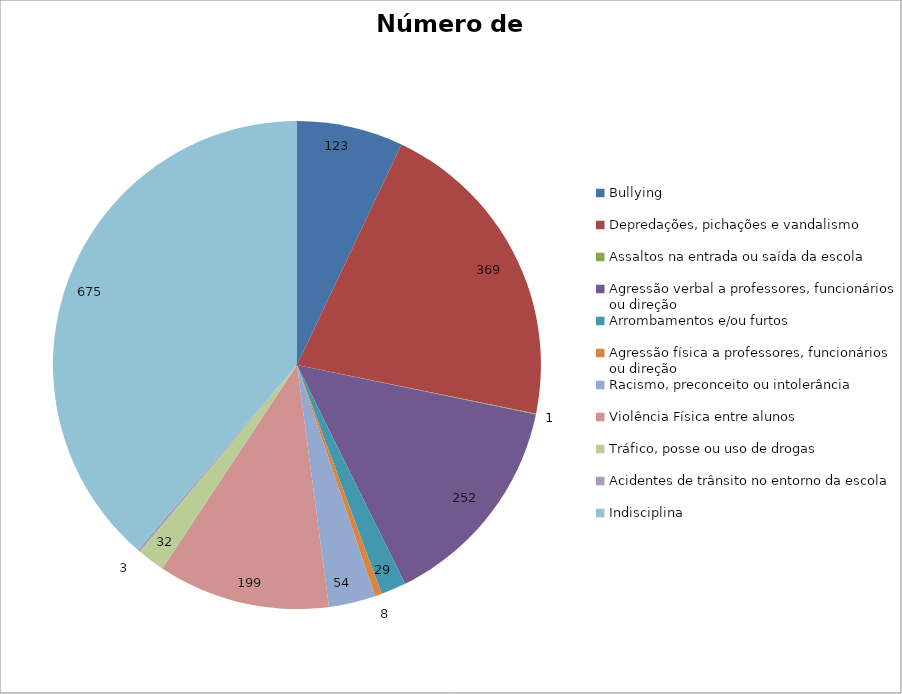
| Category | Número de Casos |
|---|---|
| Bullying | 123 |
| Depredações, pichações e vandalismo | 369 |
| Assaltos na entrada ou saída da escola | 1 |
| Agressão verbal a professores, funcionários ou direção | 252 |
| Arrombamentos e/ou furtos | 29 |
| Agressão física a professores, funcionários ou direção | 8 |
| Racismo, preconceito ou intolerância | 54 |
| Violência Física entre alunos | 199 |
| Tráfico, posse ou uso de drogas | 32 |
| Acidentes de trânsito no entorno da escola | 3 |
| Indisciplina | 675 |